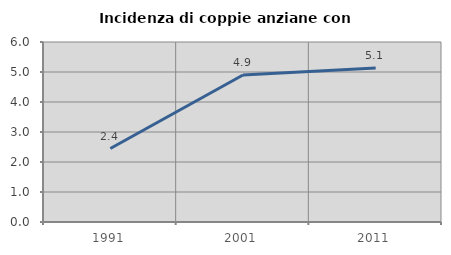
| Category | Incidenza di coppie anziane con figli |
|---|---|
| 1991.0 | 2.449 |
| 2001.0 | 4.898 |
| 2011.0 | 5.134 |